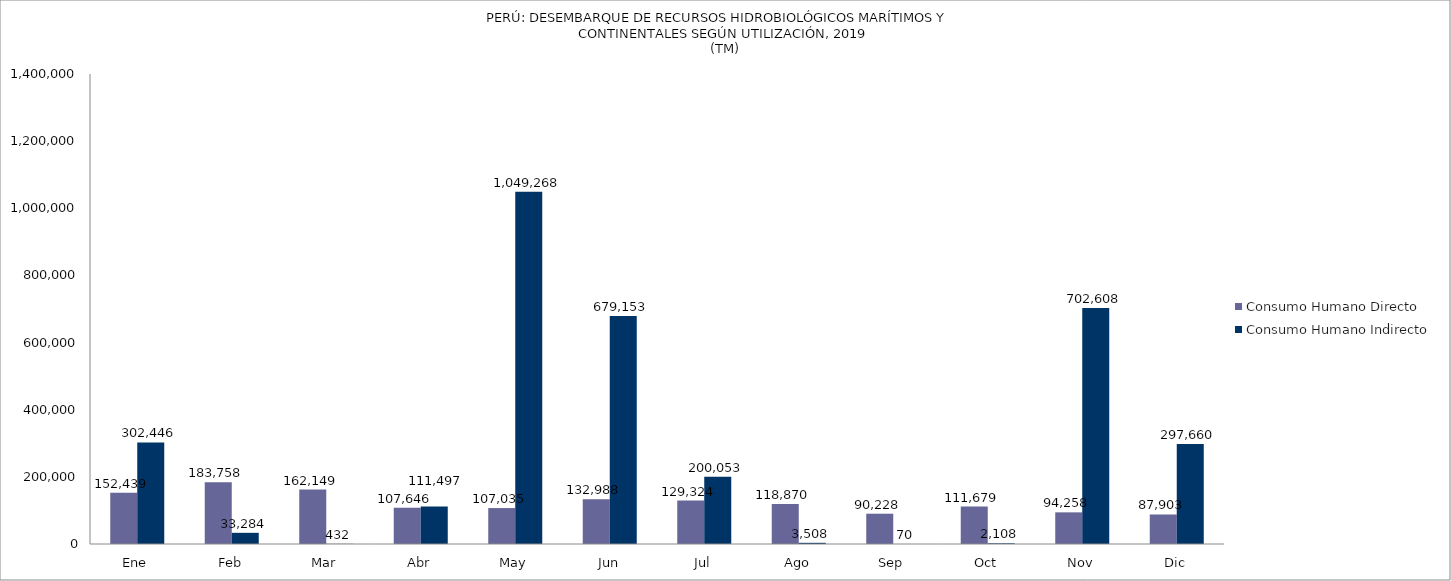
| Category | Consumo Humano Directo | Consumo Humano Indirecto |
|---|---|---|
| Ene | 152438.995 | 302446.106 |
| Feb | 183758.109 | 33283.67 |
| Mar | 162149.266 | 432.321 |
| Abr | 107645.908 | 111496.972 |
| May | 107034.829 | 1049268.438 |
| Jun | 132987.744 | 679153.25 |
| Jul | 129324.265 | 200052.641 |
| Ago | 118870.184 | 3507.521 |
| Sep | 90227.865 | 69.976 |
| Oct | 111678.597 | 2108.452 |
| Nov | 94258.32 | 702607.91 |
| Dic | 87903.221 | 297659.768 |